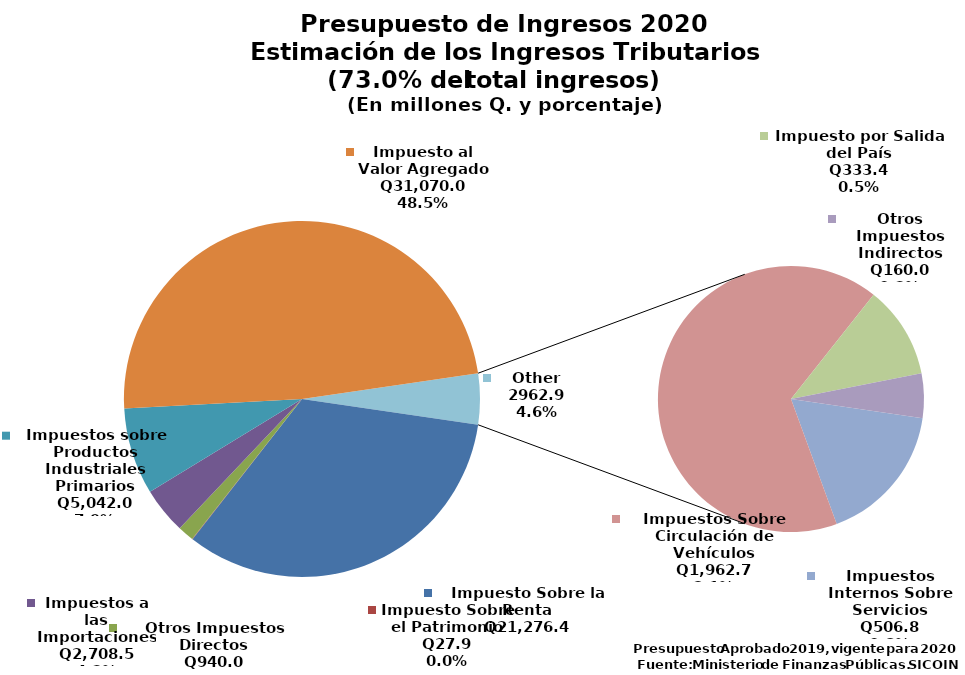
| Category | Aprobado 2017 |
|---|---|
| Impuesto Sobre la Renta | 21276.4 |
| Impuesto Sobre el Patrimonio | 27.9 |
| Otros Impuestos Directos | 940 |
| Impuestos a las Importaciones | 2708.5 |
| Impuestos sobre Productos Industriales Primarios | 5042 |
| Impuesto al Valor Agregado | 31070 |
| Impuestos Internos Sobre Servicios | 506.8 |
| Impuestos Sobre Circulación de Vehículos | 1962.7 |
| Impuesto por Salida del País | 333.4 |
| Otros Impuestos Indirectos | 160 |